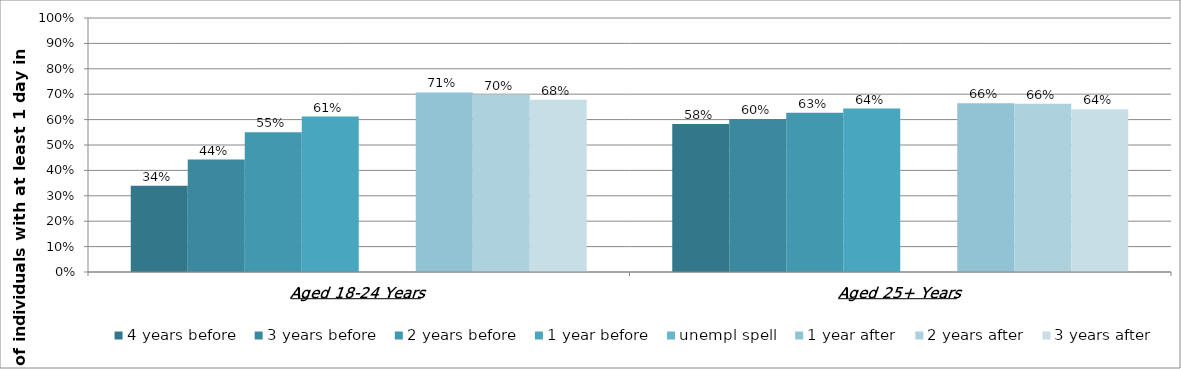
| Category | 4 years before | 3 years before | 2 years before | 1 year before | unempl spell | 1 year after | 2 years after | 3 years after |
|---|---|---|---|---|---|---|---|---|
| Aged 18-24 Years | 0.339 | 0.442 | 0.55 | 0.612 | 0 | 0.707 | 0.699 | 0.678 |
| Aged 25+ Years | 0.582 | 0.602 | 0.627 | 0.644 | 0 | 0.664 | 0.662 | 0.641 |